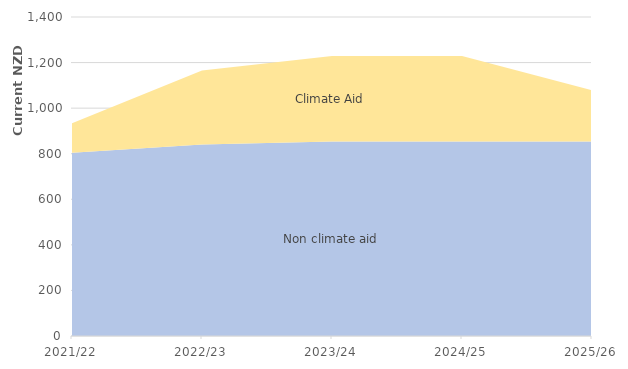
| Category | Non climate aid | Climate Aid |
|---|---|---|
| 2021/22 | 804205000 | 130000000 |
| 2022/23 | 840431000 | 325000000 |
| 2023/24 | 853463302.411 | 375000000 |
| 2024/25 | 853463302.411 | 375000000 |
| 2025/26 | 853463302.411 | 225000000 |